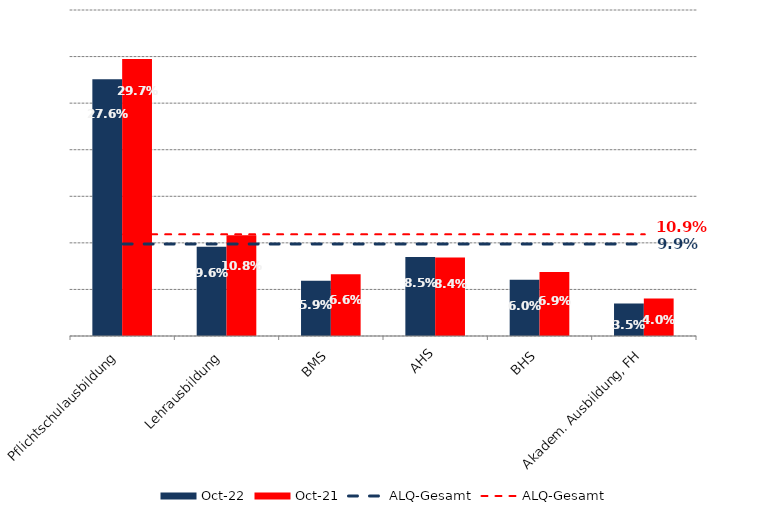
| Category | Okt 22 | Okt 21 |
|---|---|---|
| Pflichtschulausbildung | 0.276 | 0.297 |
| Lehrausbildung | 0.096 | 0.108 |
| BMS | 0.059 | 0.066 |
| AHS | 0.085 | 0.084 |
| BHS | 0.06 | 0.069 |
| Akadem. Ausbildung, FH | 0.035 | 0.04 |